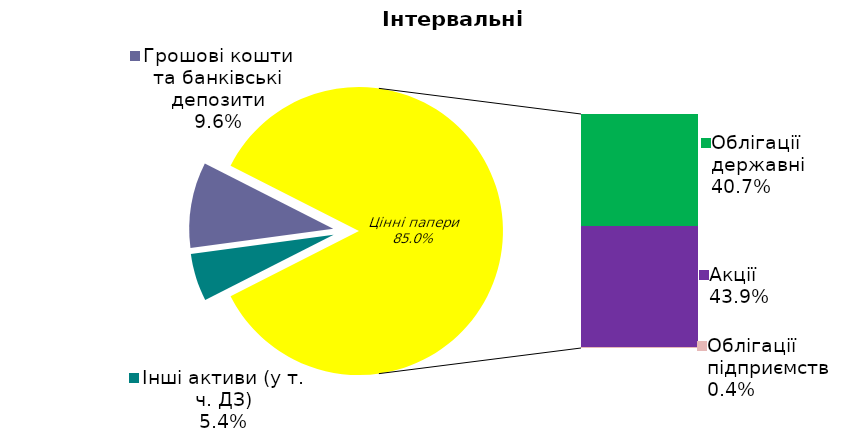
| Category | Series 0 |
|---|---|
| Інші активи (у т. ч. ДЗ) | 0.054 |
| Грошові кошти та банківські депозити | 0.096 |
| Банківські метали | 0 |
| Облігації державні  | 0.407 |
| Акції | 0.439 |
| Облігації підприємств | 0.004 |